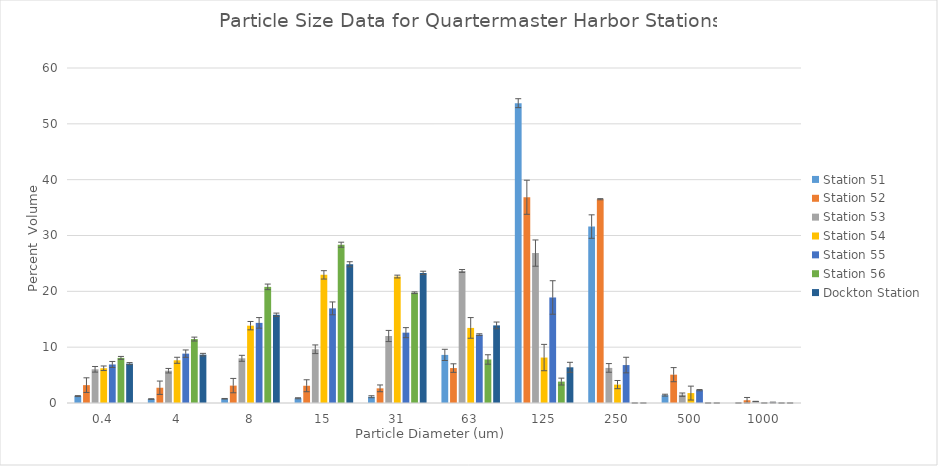
| Category | Station 51 | Station 52 | Station 53 | Station 54 | Station 55 | Station 56 | Dockton Station |
|---|---|---|---|---|---|---|---|
| 0.4 | 1.235 | 3.2 | 6.035 | 6.22 | 6.9 | 8.08 | 7.06 |
| 4.0 | 0.71 | 2.735 | 5.785 | 7.65 | 8.84 | 11.45 | 8.66 |
| 8.0 | 0.76 | 3.115 | 8.005 | 13.85 | 14.35 | 20.8 | 15.8 |
| 15.0 | 0.85 | 3.09 | 9.625 | 22.95 | 16.95 | 28.35 | 24.85 |
| 31.0 | 1.125 | 2.625 | 12 | 22.65 | 12.6 | 19.75 | 23.3 |
| 63.0 | 8.615 | 6.255 | 23.65 | 13.45 | 12.25 | 7.795 | 13.9 |
| 125.0 | 53.7 | 36.85 | 26.85 | 8.14 | 18.9 | 3.835 | 6.395 |
| 250.0 | 31.6 | 36.5 | 6.285 | 3.295 | 6.795 | 0 | 0 |
| 500.0 | 1.405 | 5.075 | 1.49 | 1.775 | 2.3 | 0 | 0 |
| 1000.0 | 0 | 0.495 | 0.285 | 0.003 | 0.077 | 0 | 0 |